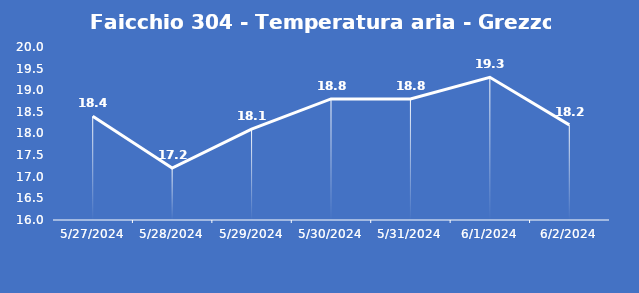
| Category | Faicchio 304 - Temperatura aria - Grezzo (°C) |
|---|---|
| 5/27/24 | 18.4 |
| 5/28/24 | 17.2 |
| 5/29/24 | 18.1 |
| 5/30/24 | 18.8 |
| 5/31/24 | 18.8 |
| 6/1/24 | 19.3 |
| 6/2/24 | 18.2 |